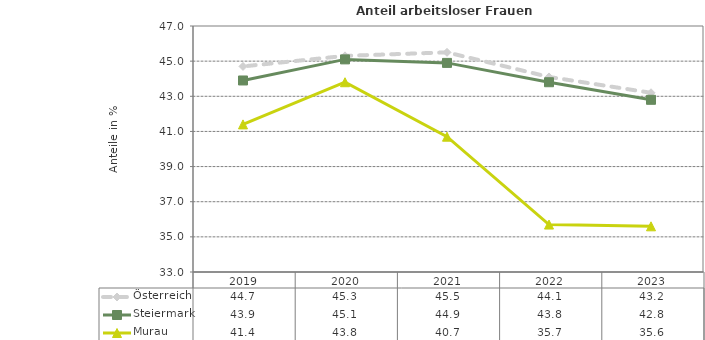
| Category | Österreich | Steiermark | Murau |
|---|---|---|---|
| 2023.0 | 43.2 | 42.8 | 35.6 |
| 2022.0 | 44.1 | 43.8 | 35.7 |
| 2021.0 | 45.5 | 44.9 | 40.7 |
| 2020.0 | 45.3 | 45.1 | 43.8 |
| 2019.0 | 44.7 | 43.9 | 41.4 |